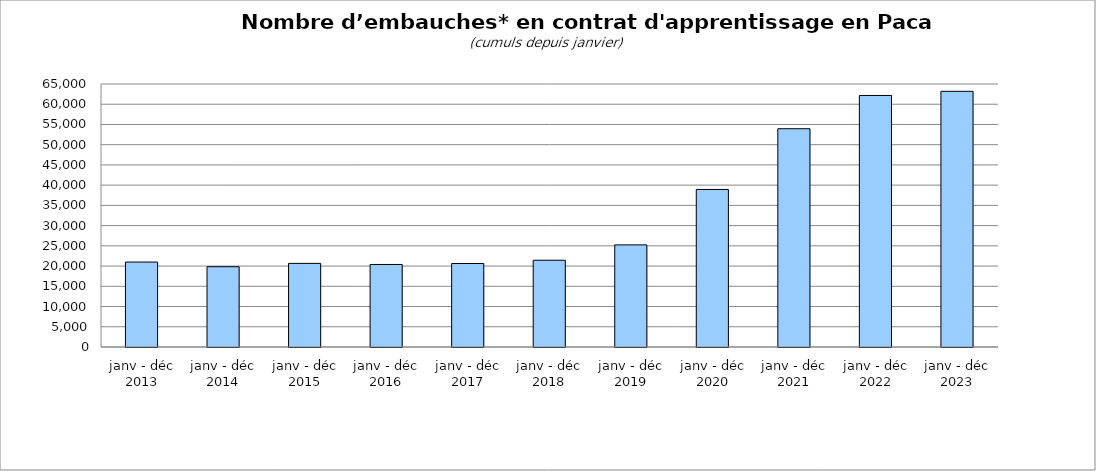
| Category | Series 0 |
|---|---|
| janv - déc 2013 | 20990 |
| janv - déc 2014 | 19839 |
| janv - déc 2015 | 20667 |
| janv - déc 2016 | 20397 |
| janv - déc 2017 | 20635 |
| janv - déc 2018 | 21443 |
| janv - déc 2019 | 25237 |
| janv - déc 2020 | 38937 |
| janv - déc 2021 | 53946 |
| janv - déc 2022 | 62163 |
| janv - déc 2023 | 63192 |